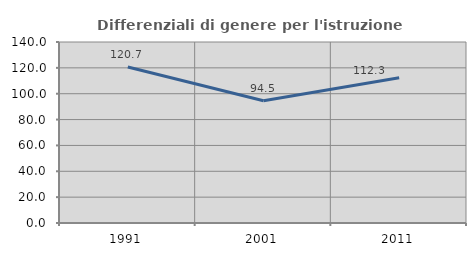
| Category | Differenziali di genere per l'istruzione superiore |
|---|---|
| 1991.0 | 120.661 |
| 2001.0 | 94.506 |
| 2011.0 | 112.331 |